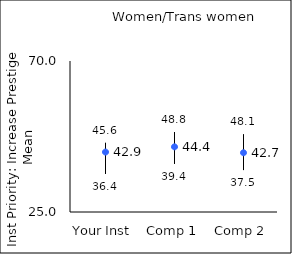
| Category | 25th percentile | 75th percentile | Mean |
|---|---|---|---|
| Your Inst | 36.4 | 45.6 | 42.87 |
| Comp 1 | 39.4 | 48.8 | 44.42 |
| Comp 2 | 37.5 | 48.1 | 42.66 |